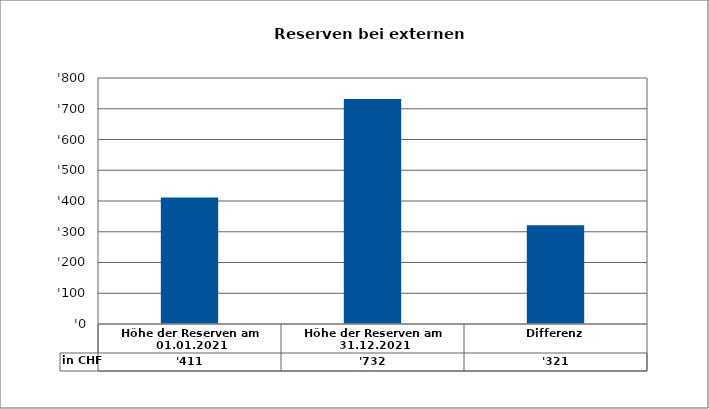
| Category | in CHF |
|---|---|
| Höhe der Reserven am 01.01.2021 | 411 |
| Höhe der Reserven am 31.12.2021 | 732 |
| Differenz | 321 |